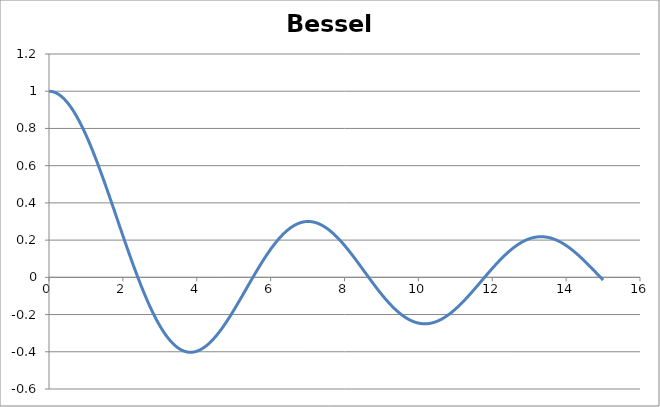
| Category | Bessel J_0(x) |
|---|---|
| 0.0 | 1 |
| 0.1 | 0.998 |
| 0.2 | 0.99 |
| 0.3 | 0.978 |
| 0.4 | 0.96 |
| 0.5 | 0.938 |
| 0.6 | 0.912 |
| 0.7 | 0.881 |
| 0.8 | 0.846 |
| 0.9 | 0.808 |
| 1.0 | 0.765 |
| 1.1 | 0.72 |
| 1.2 | 0.671 |
| 1.3 | 0.62 |
| 1.4 | 0.567 |
| 1.5 | 0.512 |
| 1.6 | 0.455 |
| 1.7 | 0.398 |
| 1.8 | 0.34 |
| 1.9 | 0.282 |
| 2.0 | 0.224 |
| 2.1 | 0.167 |
| 2.2 | 0.11 |
| 2.3 | 0.056 |
| 2.4 | 0.003 |
| 2.5 | -0.048 |
| 2.6 | -0.097 |
| 2.7 | -0.142 |
| 2.8 | -0.185 |
| 2.9 | -0.224 |
| 3.0 | -0.26 |
| 3.1 | -0.292 |
| 3.2 | -0.32 |
| 3.3 | -0.344 |
| 3.4 | -0.364 |
| 3.5 | -0.38 |
| 3.6 | -0.392 |
| 3.7 | -0.399 |
| 3.8 | -0.403 |
| 3.9 | -0.402 |
| 4.0 | -0.397 |
| 4.1 | -0.389 |
| 4.2 | -0.377 |
| 4.3 | -0.361 |
| 4.4 | -0.342 |
| 4.5 | -0.321 |
| 4.6 | -0.296 |
| 4.7 | -0.269 |
| 4.8 | -0.24 |
| 4.9 | -0.21 |
| 5.0 | -0.178 |
| 5.1 | -0.144 |
| 5.2 | -0.11 |
| 5.3 | -0.076 |
| 5.4 | -0.041 |
| 5.5 | -0.007 |
| 5.6 | 0.027 |
| 5.7 | 0.06 |
| 5.8 | 0.092 |
| 5.9 | 0.122 |
| 6.0 | 0.151 |
| 6.1 | 0.177 |
| 6.2 | 0.202 |
| 6.3 | 0.224 |
| 6.4 | 0.243 |
| 6.5 | 0.26 |
| 6.6 | 0.274 |
| 6.7 | 0.285 |
| 6.8 | 0.293 |
| 6.9 | 0.298 |
| 7.0 | 0.3 |
| 7.1 | 0.299 |
| 7.2 | 0.295 |
| 7.3 | 0.288 |
| 7.4 | 0.279 |
| 7.5 | 0.266 |
| 7.6 | 0.252 |
| 7.7 | 0.235 |
| 7.8 | 0.215 |
| 7.9 | 0.194 |
| 8.0 | 0.172 |
| 8.1 | 0.148 |
| 8.2 | 0.122 |
| 8.3 | 0.096 |
| 8.4 | 0.069 |
| 8.5 | 0.042 |
| 8.6 | 0.015 |
| 8.7 | -0.013 |
| 8.8 | -0.039 |
| 8.9 | -0.065 |
| 9.0 | -0.09 |
| 9.1 | -0.114 |
| 9.2 | -0.137 |
| 9.3 | -0.158 |
| 9.4 | -0.177 |
| 9.5 | -0.194 |
| 9.6 | -0.209 |
| 9.7 | -0.222 |
| 9.8 | -0.232 |
| 9.9 | -0.24 |
| 10.0 | -0.246 |
| 10.1 | -0.249 |
| 10.2 | -0.25 |
| 10.3 | -0.248 |
| 10.4 | -0.243 |
| 10.5 | -0.237 |
| 10.6 | -0.228 |
| 10.7 | -0.216 |
| 10.8 | -0.203 |
| 10.9 | -0.188 |
| 11.0 | -0.171 |
| 11.1 | -0.153 |
| 11.2 | -0.133 |
| 11.3 | -0.112 |
| 11.4 | -0.09 |
| 11.5 | -0.068 |
| 11.6 | -0.045 |
| 11.7 | -0.021 |
| 11.8 | 0.002 |
| 11.9 | 0.025 |
| 12.0 | 0.048 |
| 12.1 | 0.07 |
| 12.2 | 0.091 |
| 12.3 | 0.111 |
| 12.4 | 0.13 |
| 12.5 | 0.147 |
| 12.6 | 0.163 |
| 12.7 | 0.177 |
| 12.8 | 0.189 |
| 12.9 | 0.199 |
| 13.0 | 0.207 |
| 13.1 | 0.213 |
| 13.2 | 0.217 |
| 13.3 | 0.218 |
| 13.4 | 0.218 |
| 13.5 | 0.215 |
| 13.6 | 0.21 |
| 13.7 | 0.203 |
| 13.8 | 0.194 |
| 13.9 | 0.184 |
| 14.0 | 0.171 |
| 14.1 | 0.157 |
| 14.2 | 0.141 |
| 14.3 | 0.124 |
| 14.4 | 0.106 |
| 14.5 | 0.088 |
| 14.6 | 0.068 |
| 14.7 | 0.048 |
| 14.8 | 0.027 |
| 14.9 | 0.006 |
| 15.0 | -0.014 |